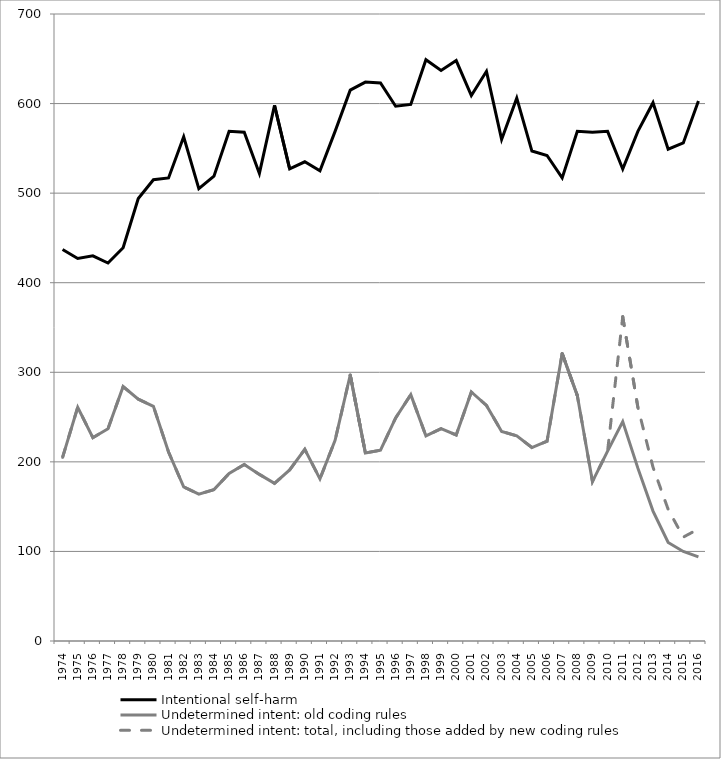
| Category | Intentional self-harm | Undetermined intent: old coding rules | Undetermined intent: total, including those added by new coding rules |
|---|---|---|---|
| 1974.0 | 437 | 205 | 205 |
| 1975.0 | 427 | 261 | 261 |
| 1976.0 | 430 | 227 | 227 |
| 1977.0 | 422 | 237 | 237 |
| 1978.0 | 439 | 284 | 284 |
| 1979.0 | 494 | 270 | 270 |
| 1980.0 | 515 | 262 | 262 |
| 1981.0 | 517 | 211 | 211 |
| 1982.0 | 563 | 172 | 172 |
| 1983.0 | 505 | 164 | 164 |
| 1984.0 | 519 | 169 | 169 |
| 1985.0 | 569 | 187 | 187 |
| 1986.0 | 568 | 197 | 197 |
| 1987.0 | 522 | 186 | 186 |
| 1988.0 | 598 | 176 | 176 |
| 1989.0 | 527 | 191 | 191 |
| 1990.0 | 535 | 214 | 214 |
| 1991.0 | 525 | 181 | 181 |
| 1992.0 | 569 | 224 | 224 |
| 1993.0 | 615 | 297 | 297 |
| 1994.0 | 624 | 210 | 210 |
| 1995.0 | 623 | 213 | 213 |
| 1996.0 | 597 | 249 | 249 |
| 1997.0 | 599 | 275 | 275 |
| 1998.0 | 649 | 229 | 229 |
| 1999.0 | 637 | 237 | 237 |
| 2000.0 | 648 | 230 | 230 |
| 2001.0 | 609 | 278 | 278 |
| 2002.0 | 636 | 263 | 263 |
| 2003.0 | 560 | 234 | 234 |
| 2004.0 | 606 | 229 | 229 |
| 2005.0 | 547 | 216 | 216 |
| 2006.0 | 542 | 223 | 223 |
| 2007.0 | 517 | 321 | 321 |
| 2008.0 | 569 | 274 | 274 |
| 2009.0 | 568 | 178 | 178 |
| 2010.0 | 569 | 212 | 212 |
| 2011.0 | 527 | 245 | 362 |
| 2012.0 | 569 | 193 | 261 |
| 2013.0 | 601 | 145 | 194 |
| 2014.0 | 549 | 110 | 147 |
| 2015.0 | 556 | 100 | 116 |
| 2016.0 | 603 | 94 | 125 |